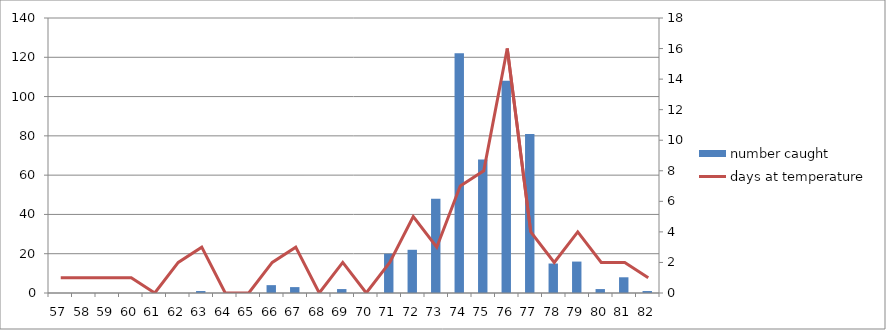
| Category | number caught |
|---|---|
| 57.0 | 0 |
| 58.0 | 0 |
| 59.0 | 0 |
| 60.0 | 0 |
| 61.0 | 0 |
| 62.0 | 0 |
| 63.0 | 1 |
| 64.0 | 0 |
| 65.0 | 0 |
| 66.0 | 4 |
| 67.0 | 3 |
| 68.0 | 0 |
| 69.0 | 2 |
| 70.0 | 0 |
| 71.0 | 20 |
| 72.0 | 22 |
| 73.0 | 48 |
| 74.0 | 122 |
| 75.0 | 68 |
| 76.0 | 108 |
| 77.0 | 81 |
| 78.0 | 15 |
| 79.0 | 16 |
| 80.0 | 2 |
| 81.0 | 8 |
| 82.0 | 1 |